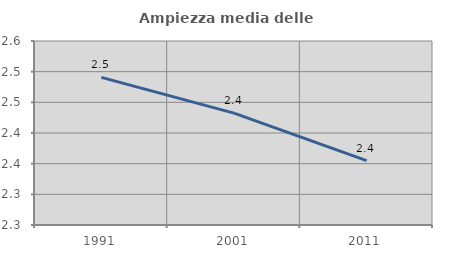
| Category | Ampiezza media delle famiglie |
|---|---|
| 1991.0 | 2.491 |
| 2001.0 | 2.432 |
| 2011.0 | 2.355 |